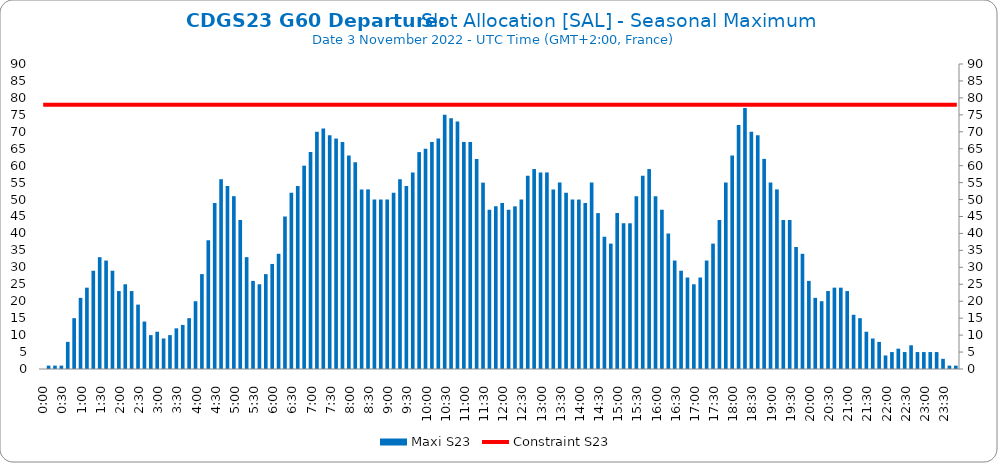
| Category | Maxi S23 |
|---|---|
| 0.0 | 0 |
| 0.006944444444444444 | 1 |
| 0.013888888888888888 | 1 |
| 0.020833333333333332 | 1 |
| 0.027777777777777776 | 8 |
| 0.034722222222222224 | 15 |
| 0.041666666666666664 | 21 |
| 0.04861111111111111 | 24 |
| 0.05555555555555555 | 29 |
| 0.0625 | 33 |
| 0.06944444444444443 | 32 |
| 0.0763888888888889 | 29 |
| 0.08333333333333333 | 23 |
| 0.09027777777777778 | 25 |
| 0.09722222222222222 | 23 |
| 0.10416666666666667 | 19 |
| 0.1111111111111111 | 14 |
| 0.11805555555555557 | 10 |
| 0.125 | 11 |
| 0.13194444444444445 | 9 |
| 0.1388888888888889 | 10 |
| 0.14583333333333334 | 12 |
| 0.15277777777777776 | 13 |
| 0.15972222222222224 | 15 |
| 0.16666666666666666 | 20 |
| 0.17361111111111113 | 28 |
| 0.18055555555555555 | 38 |
| 0.1875 | 49 |
| 0.19444444444444445 | 56 |
| 0.20138888888888887 | 54 |
| 0.20833333333333334 | 51 |
| 0.2152777777777778 | 44 |
| 0.2222222222222222 | 33 |
| 0.22916666666666666 | 26 |
| 0.23611111111111113 | 25 |
| 0.24305555555555555 | 28 |
| 0.25 | 31 |
| 0.2569444444444445 | 34 |
| 0.2638888888888889 | 45 |
| 0.2708333333333333 | 52 |
| 0.2777777777777778 | 54 |
| 0.2847222222222222 | 60 |
| 0.2916666666666667 | 64 |
| 0.2986111111111111 | 70 |
| 0.3055555555555555 | 71 |
| 0.3125 | 69 |
| 0.3194444444444445 | 68 |
| 0.3263888888888889 | 67 |
| 0.3333333333333333 | 63 |
| 0.34027777777777773 | 61 |
| 0.34722222222222227 | 53 |
| 0.3541666666666667 | 53 |
| 0.3611111111111111 | 50 |
| 0.3680555555555556 | 50 |
| 0.375 | 50 |
| 0.3819444444444444 | 52 |
| 0.3888888888888889 | 56 |
| 0.3958333333333333 | 54 |
| 0.40277777777777773 | 58 |
| 0.40972222222222227 | 64 |
| 0.4166666666666667 | 65 |
| 0.4236111111111111 | 67 |
| 0.4305555555555556 | 68 |
| 0.4375 | 75 |
| 0.4444444444444444 | 74 |
| 0.4513888888888889 | 73 |
| 0.4583333333333333 | 67 |
| 0.46527777777777773 | 67 |
| 0.47222222222222227 | 62 |
| 0.4791666666666667 | 55 |
| 0.4861111111111111 | 47 |
| 0.4930555555555556 | 48 |
| 0.5 | 49 |
| 0.5069444444444444 | 47 |
| 0.513888888888889 | 48 |
| 0.5208333333333334 | 50 |
| 0.5277777777777778 | 57 |
| 0.5347222222222222 | 59 |
| 0.5416666666666666 | 58 |
| 0.548611111111111 | 58 |
| 0.5555555555555556 | 53 |
| 0.5625 | 55 |
| 0.5694444444444444 | 52 |
| 0.576388888888889 | 50 |
| 0.5833333333333334 | 50 |
| 0.5902777777777778 | 49 |
| 0.5972222222222222 | 55 |
| 0.6041666666666666 | 46 |
| 0.611111111111111 | 39 |
| 0.6180555555555556 | 37 |
| 0.625 | 46 |
| 0.6319444444444444 | 43 |
| 0.638888888888889 | 43 |
| 0.6458333333333334 | 51 |
| 0.6527777777777778 | 57 |
| 0.6597222222222222 | 59 |
| 0.6666666666666666 | 51 |
| 0.6736111111111112 | 47 |
| 0.6805555555555555 | 40 |
| 0.6875 | 32 |
| 0.6944444444444445 | 29 |
| 0.7013888888888888 | 27 |
| 0.7083333333333334 | 25 |
| 0.7152777777777778 | 27 |
| 0.7222222222222222 | 32 |
| 0.7291666666666666 | 37 |
| 0.7361111111111112 | 44 |
| 0.7430555555555555 | 55 |
| 0.75 | 63 |
| 0.7569444444444445 | 72 |
| 0.7638888888888888 | 77 |
| 0.7708333333333334 | 70 |
| 0.7777777777777778 | 69 |
| 0.7847222222222222 | 62 |
| 0.7916666666666666 | 55 |
| 0.7986111111111112 | 53 |
| 0.8055555555555555 | 44 |
| 0.8125 | 44 |
| 0.8194444444444445 | 36 |
| 0.8263888888888888 | 34 |
| 0.8333333333333334 | 26 |
| 0.8402777777777778 | 21 |
| 0.8472222222222222 | 20 |
| 0.8541666666666666 | 23 |
| 0.8611111111111112 | 24 |
| 0.8680555555555555 | 24 |
| 0.875 | 23 |
| 0.8819444444444445 | 16 |
| 0.8888888888888888 | 15 |
| 0.8958333333333334 | 11 |
| 0.9027777777777778 | 9 |
| 0.9097222222222222 | 8 |
| 0.9166666666666666 | 4 |
| 0.9236111111111112 | 5 |
| 0.9305555555555555 | 6 |
| 0.9375 | 5 |
| 0.9444444444444445 | 7 |
| 0.9513888888888888 | 5 |
| 0.9583333333333334 | 5 |
| 0.9652777777777778 | 5 |
| 0.9722222222222222 | 5 |
| 0.9791666666666666 | 3 |
| 0.9861111111111112 | 1 |
| 0.9930555555555555 | 1 |